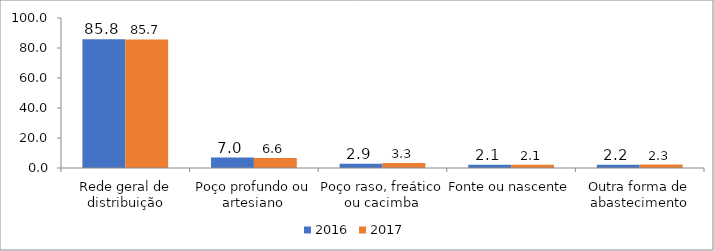
| Category | 2016 | 2017 |
|---|---|---|
| Rede geral de distribuição | 85.8 | 85.7 |
| Poço profundo ou artesiano | 7 | 6.6 |
| Poço raso, freático ou cacimba | 2.9 | 3.3 |
| Fonte ou nascente | 2.1 | 2.1 |
| Outra forma de abastecimento | 2.2 | 2.3 |